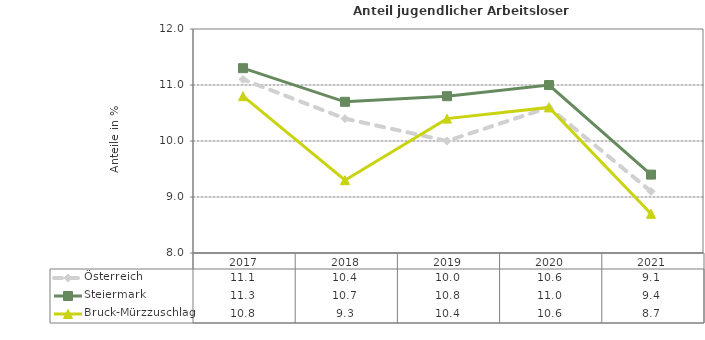
| Category | Österreich | Steiermark | Bruck-Mürzzuschlag |
|---|---|---|---|
| 2021.0 | 9.1 | 9.4 | 8.7 |
| 2020.0 | 10.6 | 11 | 10.6 |
| 2019.0 | 10 | 10.8 | 10.4 |
| 2018.0 | 10.4 | 10.7 | 9.3 |
| 2017.0 | 11.1 | 11.3 | 10.8 |